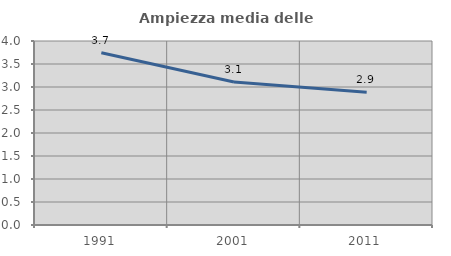
| Category | Ampiezza media delle famiglie |
|---|---|
| 1991.0 | 3.746 |
| 2001.0 | 3.109 |
| 2011.0 | 2.885 |